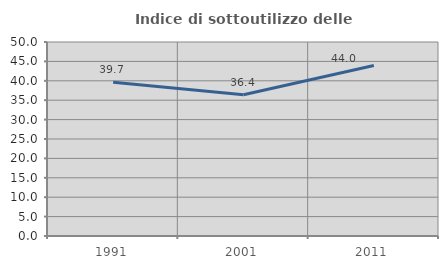
| Category | Indice di sottoutilizzo delle abitazioni  |
|---|---|
| 1991.0 | 39.655 |
| 2001.0 | 36.417 |
| 2011.0 | 43.961 |